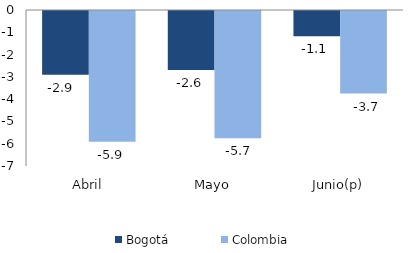
| Category | Bogotá | Colombia |
|---|---|---|
| Abril | -2.86 | -5.869 |
| Mayo | -2.647 | -5.707 |
| Junio(p) | -1.137 | -3.703 |